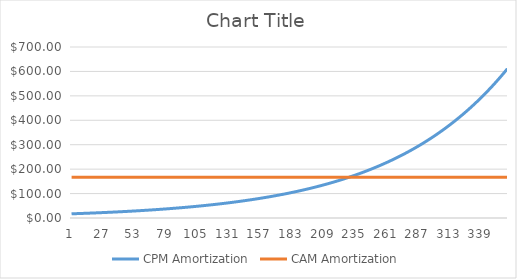
| Category | CPM Amortization | CAM Amortization |
|---|---|---|
| 0 | 17.168 | 166.667 |
| 1 | 17.339 | 166.667 |
| 2 | 17.513 | 166.667 |
| 3 | 17.688 | 166.667 |
| 4 | 17.865 | 166.667 |
| 5 | 18.043 | 166.667 |
| 6 | 18.224 | 166.667 |
| 7 | 18.406 | 166.667 |
| 8 | 18.59 | 166.667 |
| 9 | 18.776 | 166.667 |
| 10 | 18.964 | 166.667 |
| 11 | 19.153 | 166.667 |
| 12 | 19.345 | 166.667 |
| 13 | 19.538 | 166.667 |
| 14 | 19.734 | 166.667 |
| 15 | 19.931 | 166.667 |
| 16 | 20.13 | 166.667 |
| 17 | 20.332 | 166.667 |
| 18 | 20.535 | 166.667 |
| 19 | 20.74 | 166.667 |
| 20 | 20.948 | 166.667 |
| 21 | 21.157 | 166.667 |
| 22 | 21.369 | 166.667 |
| 23 | 21.582 | 166.667 |
| 24 | 21.798 | 166.667 |
| 25 | 22.016 | 166.667 |
| 26 | 22.236 | 166.667 |
| 27 | 22.459 | 166.667 |
| 28 | 22.683 | 166.667 |
| 29 | 22.91 | 166.667 |
| 30 | 23.139 | 166.667 |
| 31 | 23.371 | 166.667 |
| 32 | 23.604 | 166.667 |
| 33 | 23.84 | 166.667 |
| 34 | 24.079 | 166.667 |
| 35 | 24.32 | 166.667 |
| 36 | 24.563 | 166.667 |
| 37 | 24.808 | 166.667 |
| 38 | 25.057 | 166.667 |
| 39 | 25.307 | 166.667 |
| 40 | 25.56 | 166.667 |
| 41 | 25.816 | 166.667 |
| 42 | 26.074 | 166.667 |
| 43 | 26.335 | 166.667 |
| 44 | 26.598 | 166.667 |
| 45 | 26.864 | 166.667 |
| 46 | 27.133 | 166.667 |
| 47 | 27.404 | 166.667 |
| 48 | 27.678 | 166.667 |
| 49 | 27.955 | 166.667 |
| 50 | 28.234 | 166.667 |
| 51 | 28.517 | 166.667 |
| 52 | 28.802 | 166.667 |
| 53 | 29.09 | 166.667 |
| 54 | 29.381 | 166.667 |
| 55 | 29.675 | 166.667 |
| 56 | 29.971 | 166.667 |
| 57 | 30.271 | 166.667 |
| 58 | 30.574 | 166.667 |
| 59 | 30.879 | 166.667 |
| 60 | 31.188 | 166.667 |
| 61 | 31.5 | 166.667 |
| 62 | 31.815 | 166.667 |
| 63 | 32.133 | 166.667 |
| 64 | 32.455 | 166.667 |
| 65 | 32.779 | 166.667 |
| 66 | 33.107 | 166.667 |
| 67 | 33.438 | 166.667 |
| 68 | 33.772 | 166.667 |
| 69 | 34.11 | 166.667 |
| 70 | 34.451 | 166.667 |
| 71 | 34.796 | 166.667 |
| 72 | 35.144 | 166.667 |
| 73 | 35.495 | 166.667 |
| 74 | 35.85 | 166.667 |
| 75 | 36.209 | 166.667 |
| 76 | 36.571 | 166.667 |
| 77 | 36.936 | 166.667 |
| 78 | 37.306 | 166.667 |
| 79 | 37.679 | 166.667 |
| 80 | 38.056 | 166.667 |
| 81 | 38.436 | 166.667 |
| 82 | 38.821 | 166.667 |
| 83 | 39.209 | 166.667 |
| 84 | 39.601 | 166.667 |
| 85 | 39.997 | 166.667 |
| 86 | 40.397 | 166.667 |
| 87 | 40.801 | 166.667 |
| 88 | 41.209 | 166.667 |
| 89 | 41.621 | 166.667 |
| 90 | 42.037 | 166.667 |
| 91 | 42.457 | 166.667 |
| 92 | 42.882 | 166.667 |
| 93 | 43.311 | 166.667 |
| 94 | 43.744 | 166.667 |
| 95 | 44.181 | 166.667 |
| 96 | 44.623 | 166.667 |
| 97 | 45.069 | 166.667 |
| 98 | 45.52 | 166.667 |
| 99 | 45.975 | 166.667 |
| 100 | 46.435 | 166.667 |
| 101 | 46.899 | 166.667 |
| 102 | 47.368 | 166.667 |
| 103 | 47.842 | 166.667 |
| 104 | 48.32 | 166.667 |
| 105 | 48.804 | 166.667 |
| 106 | 49.292 | 166.667 |
| 107 | 49.785 | 166.667 |
| 108 | 50.283 | 166.667 |
| 109 | 50.785 | 166.667 |
| 110 | 51.293 | 166.667 |
| 111 | 51.806 | 166.667 |
| 112 | 52.324 | 166.667 |
| 113 | 52.847 | 166.667 |
| 114 | 53.376 | 166.667 |
| 115 | 53.91 | 166.667 |
| 116 | 54.449 | 166.667 |
| 117 | 54.993 | 166.667 |
| 118 | 55.543 | 166.667 |
| 119 | 56.099 | 166.667 |
| 120 | 56.66 | 166.667 |
| 121 | 57.226 | 166.667 |
| 122 | 57.798 | 166.667 |
| 123 | 58.376 | 166.667 |
| 124 | 58.96 | 166.667 |
| 125 | 59.55 | 166.667 |
| 126 | 60.145 | 166.667 |
| 127 | 60.747 | 166.667 |
| 128 | 61.354 | 166.667 |
| 129 | 61.968 | 166.667 |
| 130 | 62.587 | 166.667 |
| 131 | 63.213 | 166.667 |
| 132 | 63.845 | 166.667 |
| 133 | 64.484 | 166.667 |
| 134 | 65.129 | 166.667 |
| 135 | 65.78 | 166.667 |
| 136 | 66.438 | 166.667 |
| 137 | 67.102 | 166.667 |
| 138 | 67.773 | 166.667 |
| 139 | 68.451 | 166.667 |
| 140 | 69.135 | 166.667 |
| 141 | 69.827 | 166.667 |
| 142 | 70.525 | 166.667 |
| 143 | 71.23 | 166.667 |
| 144 | 71.943 | 166.667 |
| 145 | 72.662 | 166.667 |
| 146 | 73.389 | 166.667 |
| 147 | 74.123 | 166.667 |
| 148 | 74.864 | 166.667 |
| 149 | 75.612 | 166.667 |
| 150 | 76.369 | 166.667 |
| 151 | 77.132 | 166.667 |
| 152 | 77.904 | 166.667 |
| 153 | 78.683 | 166.667 |
| 154 | 79.469 | 166.667 |
| 155 | 80.264 | 166.667 |
| 156 | 81.067 | 166.667 |
| 157 | 81.877 | 166.667 |
| 158 | 82.696 | 166.667 |
| 159 | 83.523 | 166.667 |
| 160 | 84.358 | 166.667 |
| 161 | 85.202 | 166.667 |
| 162 | 86.054 | 166.667 |
| 163 | 86.915 | 166.667 |
| 164 | 87.784 | 166.667 |
| 165 | 88.662 | 166.667 |
| 166 | 89.548 | 166.667 |
| 167 | 90.444 | 166.667 |
| 168 | 91.348 | 166.667 |
| 169 | 92.262 | 166.667 |
| 170 | 93.184 | 166.667 |
| 171 | 94.116 | 166.667 |
| 172 | 95.057 | 166.667 |
| 173 | 96.008 | 166.667 |
| 174 | 96.968 | 166.667 |
| 175 | 97.937 | 166.667 |
| 176 | 98.917 | 166.667 |
| 177 | 99.906 | 166.667 |
| 178 | 100.905 | 166.667 |
| 179 | 101.914 | 166.667 |
| 180 | 102.933 | 166.667 |
| 181 | 103.963 | 166.667 |
| 182 | 105.002 | 166.667 |
| 183 | 106.052 | 166.667 |
| 184 | 107.113 | 166.667 |
| 185 | 108.184 | 166.667 |
| 186 | 109.266 | 166.667 |
| 187 | 110.358 | 166.667 |
| 188 | 111.462 | 166.667 |
| 189 | 112.577 | 166.667 |
| 190 | 113.702 | 166.667 |
| 191 | 114.839 | 166.667 |
| 192 | 115.988 | 166.667 |
| 193 | 117.148 | 166.667 |
| 194 | 118.319 | 166.667 |
| 195 | 119.502 | 166.667 |
| 196 | 120.697 | 166.667 |
| 197 | 121.904 | 166.667 |
| 198 | 123.123 | 166.667 |
| 199 | 124.355 | 166.667 |
| 200 | 125.598 | 166.667 |
| 201 | 126.854 | 166.667 |
| 202 | 128.123 | 166.667 |
| 203 | 129.404 | 166.667 |
| 204 | 130.698 | 166.667 |
| 205 | 132.005 | 166.667 |
| 206 | 133.325 | 166.667 |
| 207 | 134.658 | 166.667 |
| 208 | 136.005 | 166.667 |
| 209 | 137.365 | 166.667 |
| 210 | 138.739 | 166.667 |
| 211 | 140.126 | 166.667 |
| 212 | 141.527 | 166.667 |
| 213 | 142.942 | 166.667 |
| 214 | 144.372 | 166.667 |
| 215 | 145.816 | 166.667 |
| 216 | 147.274 | 166.667 |
| 217 | 148.746 | 166.667 |
| 218 | 150.234 | 166.667 |
| 219 | 151.736 | 166.667 |
| 220 | 153.254 | 166.667 |
| 221 | 154.786 | 166.667 |
| 222 | 156.334 | 166.667 |
| 223 | 157.897 | 166.667 |
| 224 | 159.476 | 166.667 |
| 225 | 161.071 | 166.667 |
| 226 | 162.682 | 166.667 |
| 227 | 164.309 | 166.667 |
| 228 | 165.952 | 166.667 |
| 229 | 167.611 | 166.667 |
| 230 | 169.287 | 166.667 |
| 231 | 170.98 | 166.667 |
| 232 | 172.69 | 166.667 |
| 233 | 174.417 | 166.667 |
| 234 | 176.161 | 166.667 |
| 235 | 177.923 | 166.667 |
| 236 | 179.702 | 166.667 |
| 237 | 181.499 | 166.667 |
| 238 | 183.314 | 166.667 |
| 239 | 185.147 | 166.667 |
| 240 | 186.999 | 166.667 |
| 241 | 188.869 | 166.667 |
| 242 | 190.757 | 166.667 |
| 243 | 192.665 | 166.667 |
| 244 | 194.591 | 166.667 |
| 245 | 196.537 | 166.667 |
| 246 | 198.503 | 166.667 |
| 247 | 200.488 | 166.667 |
| 248 | 202.493 | 166.667 |
| 249 | 204.518 | 166.667 |
| 250 | 206.563 | 166.667 |
| 251 | 208.628 | 166.667 |
| 252 | 210.715 | 166.667 |
| 253 | 212.822 | 166.667 |
| 254 | 214.95 | 166.667 |
| 255 | 217.1 | 166.667 |
| 256 | 219.271 | 166.667 |
| 257 | 221.463 | 166.667 |
| 258 | 223.678 | 166.667 |
| 259 | 225.915 | 166.667 |
| 260 | 228.174 | 166.667 |
| 261 | 230.456 | 166.667 |
| 262 | 232.76 | 166.667 |
| 263 | 235.088 | 166.667 |
| 264 | 237.439 | 166.667 |
| 265 | 239.813 | 166.667 |
| 266 | 242.211 | 166.667 |
| 267 | 244.633 | 166.667 |
| 268 | 247.079 | 166.667 |
| 269 | 249.55 | 166.667 |
| 270 | 252.046 | 166.667 |
| 271 | 254.566 | 166.667 |
| 272 | 257.112 | 166.667 |
| 273 | 259.683 | 166.667 |
| 274 | 262.28 | 166.667 |
| 275 | 264.903 | 166.667 |
| 276 | 267.552 | 166.667 |
| 277 | 270.227 | 166.667 |
| 278 | 272.929 | 166.667 |
| 279 | 275.659 | 166.667 |
| 280 | 278.415 | 166.667 |
| 281 | 281.2 | 166.667 |
| 282 | 284.012 | 166.667 |
| 283 | 286.852 | 166.667 |
| 284 | 289.72 | 166.667 |
| 285 | 292.617 | 166.667 |
| 286 | 295.544 | 166.667 |
| 287 | 298.499 | 166.667 |
| 288 | 301.484 | 166.667 |
| 289 | 304.499 | 166.667 |
| 290 | 307.544 | 166.667 |
| 291 | 310.619 | 166.667 |
| 292 | 313.725 | 166.667 |
| 293 | 316.863 | 166.667 |
| 294 | 320.031 | 166.667 |
| 295 | 323.232 | 166.667 |
| 296 | 326.464 | 166.667 |
| 297 | 329.729 | 166.667 |
| 298 | 333.026 | 166.667 |
| 299 | 336.356 | 166.667 |
| 300 | 339.72 | 166.667 |
| 301 | 343.117 | 166.667 |
| 302 | 346.548 | 166.667 |
| 303 | 350.013 | 166.667 |
| 304 | 353.514 | 166.667 |
| 305 | 357.049 | 166.667 |
| 306 | 360.619 | 166.667 |
| 307 | 364.225 | 166.667 |
| 308 | 367.868 | 166.667 |
| 309 | 371.546 | 166.667 |
| 310 | 375.262 | 166.667 |
| 311 | 379.014 | 166.667 |
| 312 | 382.805 | 166.667 |
| 313 | 386.633 | 166.667 |
| 314 | 390.499 | 166.667 |
| 315 | 394.404 | 166.667 |
| 316 | 398.348 | 166.667 |
| 317 | 402.331 | 166.667 |
| 318 | 406.355 | 166.667 |
| 319 | 410.418 | 166.667 |
| 320 | 414.523 | 166.667 |
| 321 | 418.668 | 166.667 |
| 322 | 422.854 | 166.667 |
| 323 | 427.083 | 166.667 |
| 324 | 431.354 | 166.667 |
| 325 | 435.667 | 166.667 |
| 326 | 440.024 | 166.667 |
| 327 | 444.424 | 166.667 |
| 328 | 448.868 | 166.667 |
| 329 | 453.357 | 166.667 |
| 330 | 457.891 | 166.667 |
| 331 | 462.47 | 166.667 |
| 332 | 467.094 | 166.667 |
| 333 | 471.765 | 166.667 |
| 334 | 476.483 | 166.667 |
| 335 | 481.248 | 166.667 |
| 336 | 486.06 | 166.667 |
| 337 | 490.921 | 166.667 |
| 338 | 495.83 | 166.667 |
| 339 | 500.788 | 166.667 |
| 340 | 505.796 | 166.667 |
| 341 | 510.854 | 166.667 |
| 342 | 515.963 | 166.667 |
| 343 | 521.122 | 166.667 |
| 344 | 526.334 | 166.667 |
| 345 | 531.597 | 166.667 |
| 346 | 536.913 | 166.667 |
| 347 | 542.282 | 166.667 |
| 348 | 547.705 | 166.667 |
| 349 | 553.182 | 166.667 |
| 350 | 558.714 | 166.667 |
| 351 | 564.301 | 166.667 |
| 352 | 569.944 | 166.667 |
| 353 | 575.643 | 166.667 |
| 354 | 581.4 | 166.667 |
| 355 | 587.214 | 166.667 |
| 356 | 593.086 | 166.667 |
| 357 | 599.017 | 166.667 |
| 358 | 605.007 | 166.667 |
| 359 | 611.057 | 166.667 |